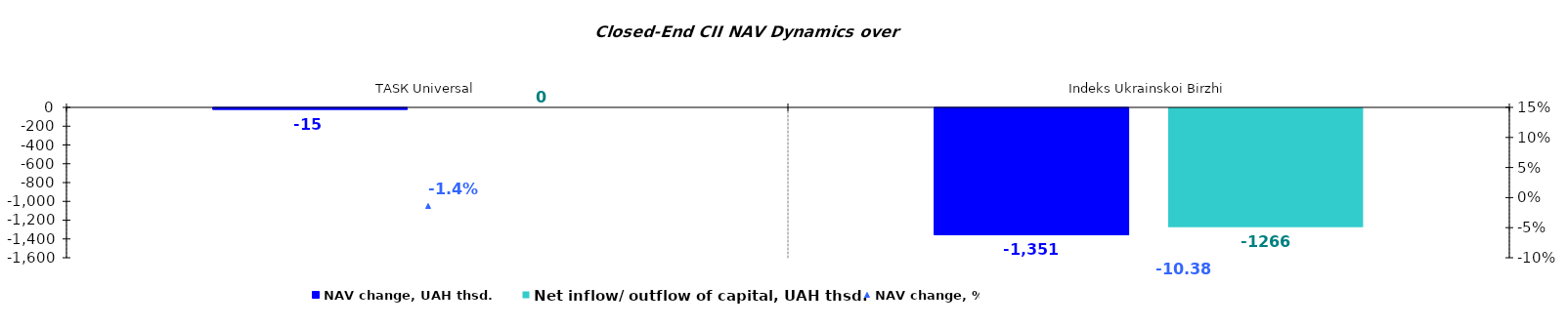
| Category | NAV change, UAH thsd. | Net inflow/ outflow of capital, UAH thsd. |
|---|---|---|
| ТАSК Universal | -15.086 | 0 |
| Іndeks Ukrainskoi Birzhi | -1350.636 | -1266.218 |